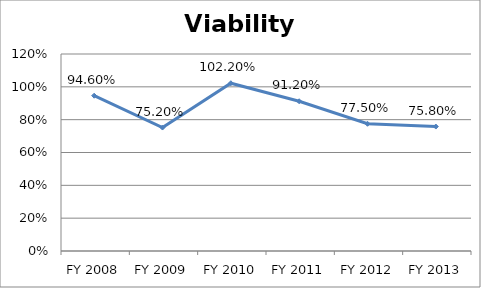
| Category | Viability ratio |
|---|---|
| FY 2013 | 0.758 |
| FY 2012 | 0.775 |
| FY 2011 | 0.912 |
| FY 2010 | 1.022 |
| FY 2009 | 0.752 |
| FY 2008 | 0.946 |